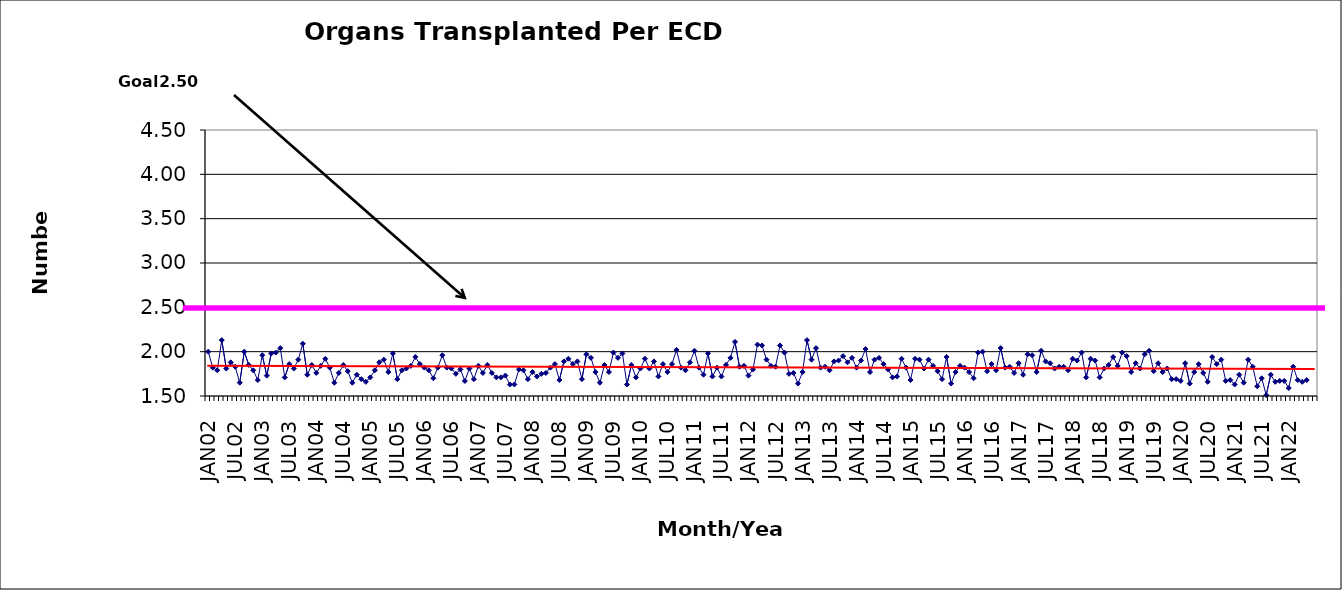
| Category | Series 0 |
|---|---|
| JAN02 | 2 |
| FEB02 | 1.82 |
| MAR02 | 1.79 |
| APR02 | 2.13 |
| MAY02 | 1.81 |
| JUN02 | 1.88 |
| JUL02 | 1.83 |
| AUG02 | 1.65 |
| SEP02 | 2 |
| OCT02 | 1.85 |
| NOV02 | 1.79 |
| DEC02 | 1.68 |
| JAN03 | 1.96 |
| FEB03 | 1.73 |
| MAR03 | 1.98 |
| APR03 | 1.99 |
| MAY03 | 2.04 |
| JUN03 | 1.71 |
| JUL03 | 1.86 |
| AUG03 | 1.81 |
| SEP03 | 1.91 |
| OCT03 | 2.09 |
| NOV03 | 1.74 |
| DEC03 | 1.85 |
| JAN04 | 1.76 |
| FEB04 | 1.84 |
| MAR04 | 1.92 |
| APR04 | 1.82 |
| MAY04 | 1.65 |
| JUN04 | 1.76 |
| JUL04 | 1.85 |
| AUG04 | 1.78 |
| SEP04 | 1.65 |
| OCT04 | 1.74 |
| NOV04 | 1.69 |
| DEC04 | 1.66 |
| JAN05 | 1.71 |
| FEB05 | 1.79 |
| MAR05 | 1.88 |
| APR05 | 1.91 |
| MAY05 | 1.77 |
| JUN05 | 1.98 |
| JUL05 | 1.69 |
| AUG05 | 1.79 |
| SEP05 | 1.81 |
| OCT05 | 1.84 |
| NOV05 | 1.94 |
| DEC05 | 1.86 |
| JAN06 | 1.82 |
| FEB06 | 1.79 |
| MAR06 | 1.7 |
| APR06 | 1.82 |
| MAY06 | 1.96 |
| JUN06 | 1.82 |
| JUL06 | 1.81 |
| AUG06 | 1.75 |
| SEP06 | 1.8 |
| OCT06 | 1.67 |
| NOV06 | 1.81 |
| DEC06 | 1.69 |
| JAN07 | 1.84 |
| FEB07 | 1.76 |
| MAR07 | 1.85 |
| APR07 | 1.76 |
| MAY07 | 1.71 |
| JUN07 | 1.71 |
| JUL07 | 1.73 |
| AUG07 | 1.63 |
| SEP07 | 1.63 |
| OCT07 | 1.8 |
| NOV07 | 1.79 |
| DEC07 | 1.69 |
| JAN08 | 1.77 |
| FEB08 | 1.72 |
| MAR08 | 1.75 |
| APR08 | 1.76 |
| MAY08 | 1.82 |
| JUN08 | 1.86 |
| JUL08 | 1.68 |
| AUG08 | 1.89 |
| SEP08 | 1.92 |
| OCT08 | 1.86 |
| NOV08 | 1.89 |
| DEC08 | 1.69 |
| JAN09 | 1.97 |
| FEB09 | 1.93 |
| MAR09 | 1.77 |
| APR09 | 1.65 |
| MAY09 | 1.85 |
| JUN09 | 1.77 |
| JUL09 | 1.99 |
| AUG09 | 1.93 |
| SEP09 | 1.98 |
| OCT09 | 1.63 |
| NOV09 | 1.85 |
| DEC09 | 1.71 |
| JAN10 | 1.81 |
| FEB10 | 1.92 |
| MAR10 | 1.81 |
| APR10 | 1.89 |
| MAY10 | 1.72 |
| JUN10 | 1.86 |
| JUL10 | 1.77 |
| AUG10 | 1.86 |
| SEP10 | 2.02 |
| OCT10 | 1.82 |
| NOV10 | 1.79 |
| DEC10 | 1.88 |
| JAN11 | 2.01 |
| FEB11 | 1.82 |
| MAR11 | 1.74 |
| APR11 | 1.98 |
| MAY11 | 1.72 |
| JUN11 | 1.82 |
| JUL11 | 1.72 |
| AUG11 | 1.85 |
| SEP11 | 1.93 |
| OCT11 | 2.11 |
| NOV11 | 1.83 |
| DEC11 | 1.84 |
| JAN12 | 1.73 |
| FEB12 | 1.8 |
| MAR12 | 2.08 |
| APR12 | 2.07 |
| MAY12 | 1.91 |
| JUN12 | 1.84 |
| JUL12 | 1.83 |
| AUG12 | 2.07 |
| SEP12 | 1.99 |
| OCT12 | 1.75 |
| NOV12 | 1.76 |
| DEC12 | 1.64 |
| JAN13 | 1.77 |
| FEB13 | 2.13 |
| MAR13 | 1.91 |
| APR13 | 2.04 |
| MAY13 | 1.82 |
| JUN13 | 1.83 |
| JUL13 | 1.79 |
| AUG13 | 1.89 |
| SEP13 | 1.9 |
| OCT13 | 1.95 |
| NOV13 | 1.88 |
| DEC13 | 1.93 |
| JAN14 | 1.82 |
| FEB14 | 1.9 |
| MAR14 | 2.03 |
| APR14 | 1.77 |
| MAY14 | 1.91 |
| JUN14 | 1.93 |
| JUL14 | 1.86 |
| AUG14 | 1.8 |
| SEP14 | 1.71 |
| OCT14 | 1.72 |
| NOV14 | 1.92 |
| DEC14 | 1.82 |
| JAN15 | 1.68 |
| FEB15 | 1.92 |
| MAR15 | 1.91 |
| APR15 | 1.81 |
| MAY15 | 1.91 |
| JUN15 | 1.84 |
| JUL15 | 1.78 |
| AUG15 | 1.69 |
| SEP15 | 1.94 |
| OCT15 | 1.64 |
| NOV15 | 1.77 |
| DEC15 | 1.84 |
| JAN16 | 1.82 |
| FEB16 | 1.77 |
| MAR16 | 1.7 |
| APR16 | 1.99 |
| MAY16 | 2 |
| JUN16 | 1.78 |
| JUL16 | 1.86 |
| AUG16 | 1.79 |
| SEP16 | 2.04 |
| OCT16 | 1.82 |
| NOV16 | 1.83 |
| DEC16 | 1.76 |
| JAN17 | 1.87 |
| FEB17 | 1.74 |
| MAR17 | 1.97 |
| APR17 | 1.96 |
| MAY17 | 1.77 |
| JUN17 | 2.01 |
| JUL17 | 1.89 |
| AUG17 | 1.87 |
| SEP17 | 1.81 |
| OCT17 | 1.83 |
| NOV17 | 1.83 |
| DEC17 | 1.79 |
| JAN18 | 1.92 |
| FEB18 | 1.9 |
| MAR18 | 1.99 |
| APR18 | 1.71 |
| MAY18 | 1.92 |
| JUN18 | 1.9 |
| JUL18 | 1.71 |
| AUG18 | 1.81 |
| SEP18 | 1.85 |
| OCT18 | 1.94 |
| NOV18 | 1.84 |
| DEC18 | 1.99 |
| JAN19 | 1.95 |
| FEB19 | 1.77 |
| MAR19 | 1.87 |
| APR19 | 1.81 |
| MAY19 | 1.97 |
| JUN19 | 2.01 |
| JUL19 | 1.78 |
| AUG19 | 1.87 |
| SEP19 | 1.77 |
| OCT19 | 1.81 |
| NOV19 | 1.69 |
| DEC19 | 1.69 |
| JAN20 | 1.67 |
| FEB20 | 1.87 |
| MAR20 | 1.64 |
| APR20 | 1.77 |
| MAY20 | 1.86 |
| JUN20 | 1.76 |
| JUL20 | 1.66 |
| AUG20 | 1.94 |
| SEP20 | 1.86 |
| OCT20 | 1.91 |
| NOV20 | 1.67 |
| DEC20 | 1.68 |
| JAN21 | 1.63 |
| FEB21 | 1.74 |
| MAR21 | 1.65 |
| APR21 | 1.91 |
| MAY21 | 1.83 |
| JUN21 | 1.61 |
| JUL21 | 1.7 |
| AUG21 | 1.51 |
| SEP21 | 1.74 |
| OCT21 | 1.66 |
| NOV21 | 1.67 |
| DEC21 | 1.67 |
| JAN22 | 1.59 |
| FEB22 | 1.83 |
| MAR22 | 1.68 |
| APR22 | 1.66 |
| MAY22 | 1.68 |